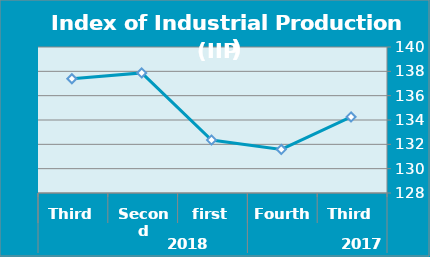
| Category | Series 0 |
|---|---|
| 0 | 134.25 |
| 1 | 131.58 |
| 2 | 132.35 |
| 3 | 137.87 |
| 4 | 137.39 |